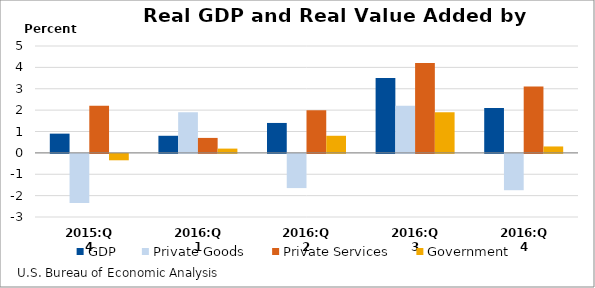
| Category | GDP | Private Goods | Private Services | Government |
|---|---|---|---|---|
| 2015:Q4 | 0.9 | -2.3 | 2.2 | -0.3 |
| 2016:Q1 | 0.8 | 1.9 | 0.7 | 0.2 |
| 2016:Q2 | 1.4 | -1.6 | 2 | 0.8 |
| 2016:Q3 | 3.5 | 2.2 | 4.2 | 1.9 |
| 2016:Q4 | 2.1 | -1.7 | 3.1 | 0.3 |